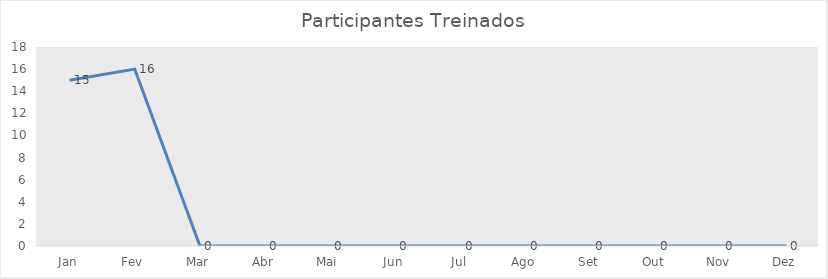
| Category | Participantes Treinados |
|---|---|
| Jan | 15 |
| Fev | 16 |
| Mar | 0 |
| Abr | 0 |
| Mai | 0 |
| Jun | 0 |
| Jul | 0 |
| Ago | 0 |
| Set | 0 |
| Out | 0 |
| Nov | 0 |
| Dez | 0 |